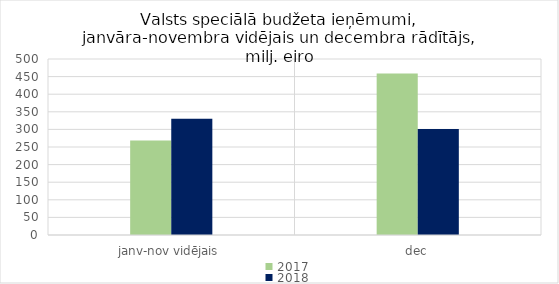
| Category | 2017 | 2018 |
|---|---|---|
| janv-nov vidējais | 268288.015 | 330199.424 |
| dec | 458943.507 | 300963.059 |